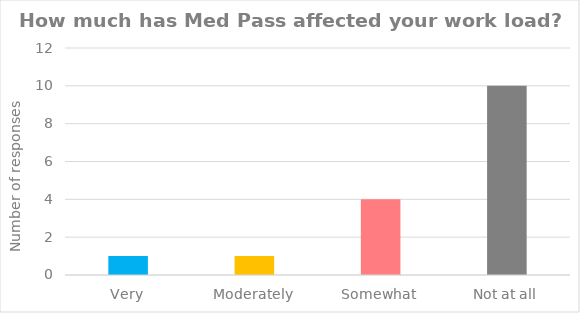
| Category | Series 0 |
|---|---|
| Very | 1 |
| Moderately | 1 |
| Somewhat | 4 |
| Not at all | 10 |